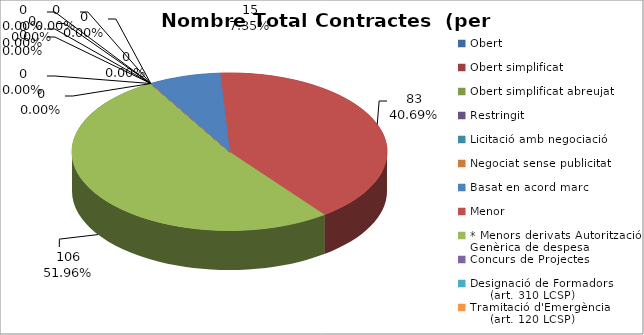
| Category | Nombre Total Contractes |
|---|---|
| Obert | 0 |
| Obert simplificat | 0 |
| Obert simplificat abreujat | 0 |
| Restringit | 0 |
| Licitació amb negociació | 0 |
| Negociat sense publicitat | 0 |
| Basat en acord marc | 15 |
| Menor | 83 |
| * Menors derivats Autorització Genèrica de despesa | 106 |
| Concurs de Projectes | 0 |
| Designació de Formadors
     (art. 310 LCSP) | 0 |
| Tramitació d'Emergència
     (art. 120 LCSP) | 0 |